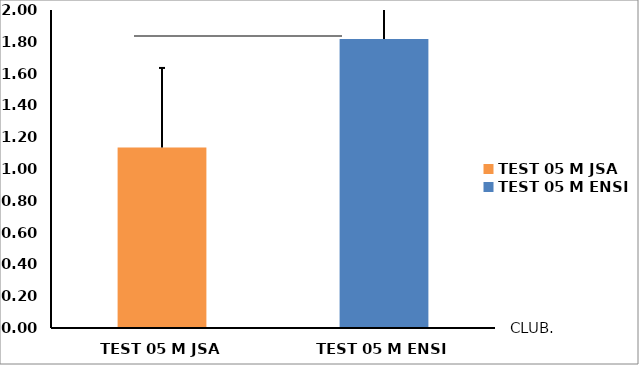
| Category | Series 0 |
|---|---|
| TEST 05 M JSA | 1.136 |
| TEST 05 M ENSI | 1.818 |